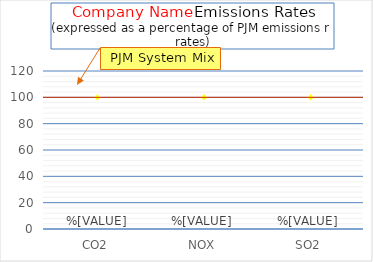
| Category | % of PJM Emissions |
|---|---|
| CO2 | 0 |
| NOX | 0 |
| SO2 | 0 |